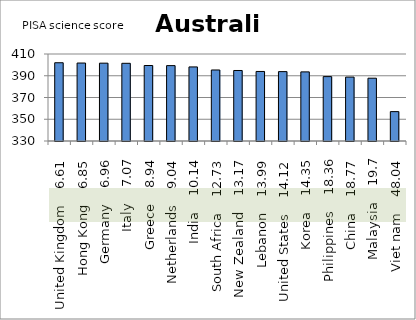
| Category | Australia |
|---|---|
| United Kingdom    6.61 | 401.955 |
| Hong Kong    6.85 | 401.692 |
| Germany    6.96 | 401.57 |
| Italy    7.07 | 401.447 |
| Greece    8.94 | 399.418 |
| Netherlands    9.04 | 399.311 |
| India    10.14 | 398.116 |
| South Africa    12.73 | 395.31 |
| New Zealand    13.17 | 394.831 |
| Lebanon    13.99 | 393.948 |
| United States    14.12 | 393.805 |
| Korea    14.35 | 393.558 |
| Philippines    18.36 | 389.207 |
| China    18.77 | 388.764 |
| Malaysia    19.7 | 387.758 |
| Viet nam    48.04 | 357.014 |